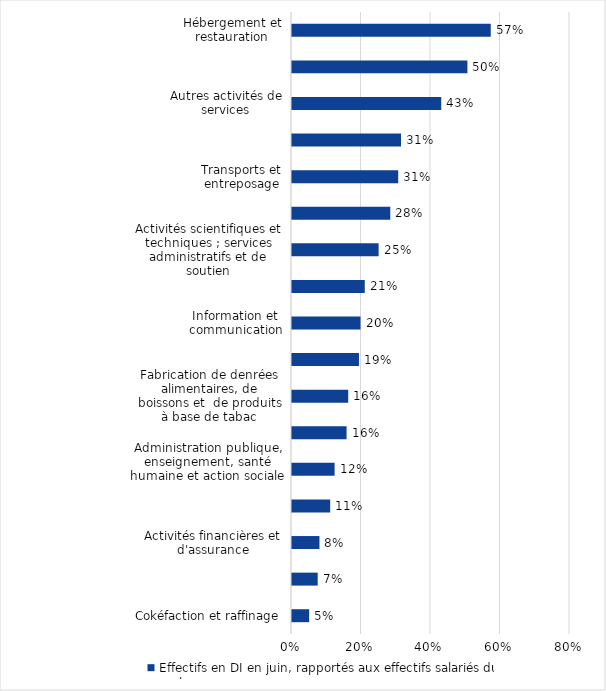
| Category | Effectifs en DI en juin, rapportés aux effectifs salariés du secteur |
|---|---|
| Cokéfaction et raffinage | 0.049 |
| Industries extractives,  énergie, eau, gestion des déchets et dépollution | 0.074 |
| Activités financières et d'assurance | 0.079 |
| Activités immobilières | 0.11 |
| Administration publique, enseignement, santé humaine et action sociale | 0.123 |
| Construction | 0.157 |
| Fabrication de denrées alimentaires, de boissons et  de produits à base de tabac | 0.162 |
| Agriculture, sylviculture et pêche | 0.193 |
| Information et communication | 0.197 |
| Commerce ; réparation d'automobiles et de motocycles | 0.209 |
| Activités scientifiques et techniques ; services administratifs et de soutien | 0.249 |
| Fabrication d'autres produits industriels | 0.283 |
| Transports et entreposage | 0.306 |
| Fabrication d'équipements électriques, électroniques, informatiques ; fabrication de machines | 0.314 |
| Autres activités de services | 0.429 |
| Fabrication de matériels de transport | 0.505 |
| Hébergement et restauration | 0.572 |